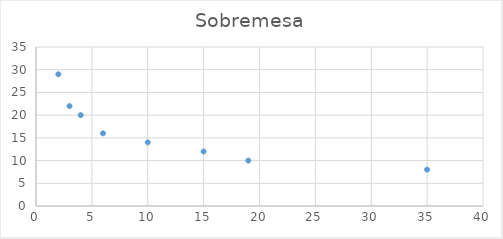
| Category | Sobremesa |
|---|---|
| 35.0 | 8 |
| 19.0 | 10 |
| 15.0 | 12 |
| 10.0 | 14 |
| 6.0 | 16 |
| 4.0 | 20 |
| 3.0 | 22 |
| 2.0 | 29 |